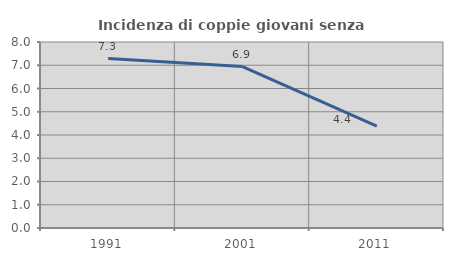
| Category | Incidenza di coppie giovani senza figli |
|---|---|
| 1991.0 | 7.288 |
| 2001.0 | 6.941 |
| 2011.0 | 4.38 |